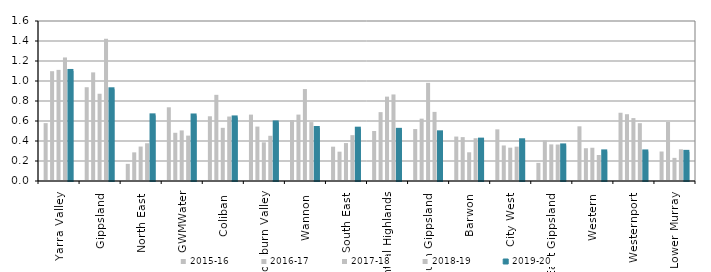
| Category | 2015-16 | 2016-17 | 2017-18 | 2018-19 | 2019-20 |
|---|---|---|---|---|---|
| Yarra Valley  | 0.579 | 1.098 | 1.111 | 1.236 | 1.1 |
| Gippsland  | 0.938 | 1.086 | 0.873 | 1.422 | 0.917 |
| North East  | 0.171 | 0.286 | 0.344 | 0.377 | 0.656 |
| GWMWater | 0.737 | 0.482 | 0.506 | 0.454 | 0.655 |
| Coliban  | 0.647 | 0.862 | 0.532 | 0.645 | 0.636 |
| Goulburn Valley  | 0.664 | 0.544 | 0.387 | 0.452 | 0.586 |
| Wannon  | 0.61 | 0.664 | 0.919 | 0.589 | 0.53 |
| South East  | 0.343 | 0.293 | 0.379 | 0.459 | 0.523 |
| Central Highlands  | 0.5 | 0.689 | 0.844 | 0.866 | 0.512 |
| South Gippsland  | 0.519 | 0.624 | 0.982 | 0.691 | 0.487 |
| Barwon  | 0.444 | 0.439 | 0.287 | 0.428 | 0.414 |
| City West  | 0.517 | 0.355 | 0.333 | 0.343 | 0.407 |
| East Gippsland  | 0.181 | 0.405 | 0.366 | 0.365 | 0.356 |
| Western  | 0.547 | 0.328 | 0.332 | 0.26 | 0.296 |
| Westernport  | 0.682 | 0.668 | 0.629 | 0.578 | 0.296 |
| Lower Murray  | 0.295 | 0.59 | 0.231 | 0.317 | 0.291 |